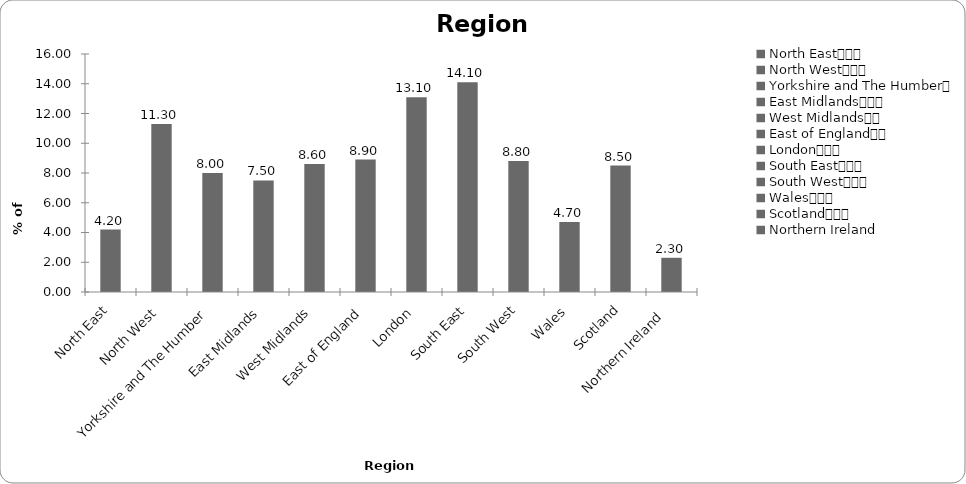
| Category | Region |
|---|---|
| North East			 | 4.2 |
| North West			 | 11.3 |
| Yorkshire and The Humber	 | 8 |
| East Midlands			 | 7.5 |
| West Midlands		 | 8.6 |
| East of England		 | 8.9 |
| London			 | 13.1 |
| South East			 | 14.1 |
| South West			 | 8.8 |
| Wales			 | 4.7 |
| Scotland			 | 8.5 |
| Northern Ireland  | 2.3 |